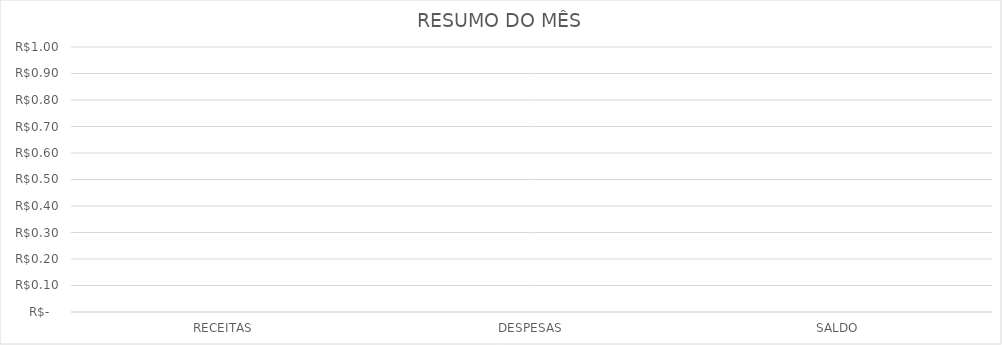
| Category | Series 0 |
|---|---|
| RECEITAS | 0 |
| DESPESAS | 0 |
| SALDO | 0 |